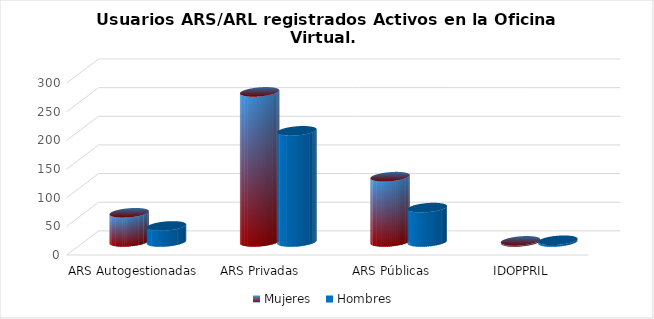
| Category | Mujeres | Hombres |
|---|---|---|
| ARS Autogestionadas | 51 | 28 |
| ARS Privadas | 262 | 194 |
| ARS Públicas | 114 | 60 |
| IDOPPRIL | 2 | 3 |